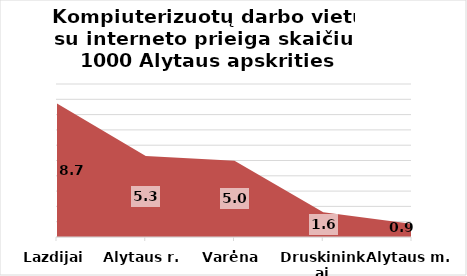
| Category | Series 0 |
|---|---|
| Lazdijai | 8.73 |
| Alytaus r. | 5.29 |
| Varėna | 4.98 |
| Druskininkai | 1.62 |
| Alytaus m. | 0.85 |